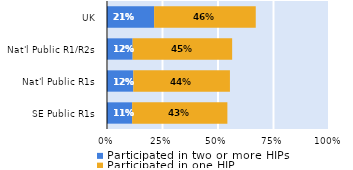
| Category | Participated in two or more HIPs | Participated in one HIP |
|---|---|---|
| SE Public R1s | 0.113 | 0.429 |
| Nat'l Public R1s | 0.119 | 0.435 |
| Nat'l Public R1/R2s | 0.115 | 0.448 |
| UK | 0.212 | 0.458 |